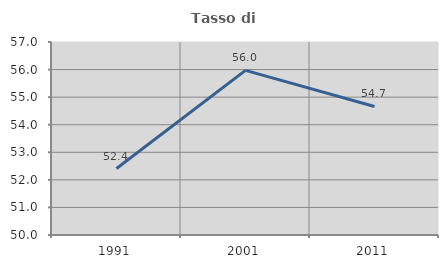
| Category | Tasso di occupazione   |
|---|---|
| 1991.0 | 52.411 |
| 2001.0 | 55.97 |
| 2011.0 | 54.663 |